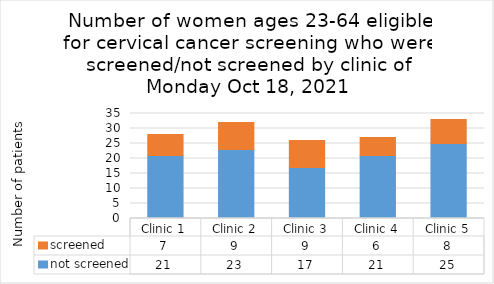
| Category | not screened | screened |
|---|---|---|
| Clinic 1 | 21 | 7 |
| Clinic 2 | 23 | 9 |
| Clinic 3 | 17 | 9 |
| Clinic 4 | 21 | 6 |
| Clinic 5 | 25 | 8 |